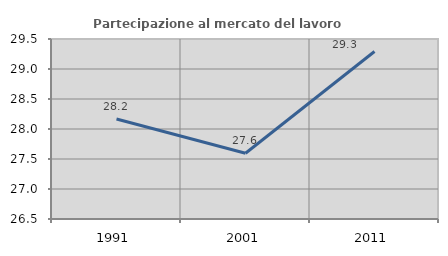
| Category | Partecipazione al mercato del lavoro  femminile |
|---|---|
| 1991.0 | 28.166 |
| 2001.0 | 27.595 |
| 2011.0 | 29.292 |